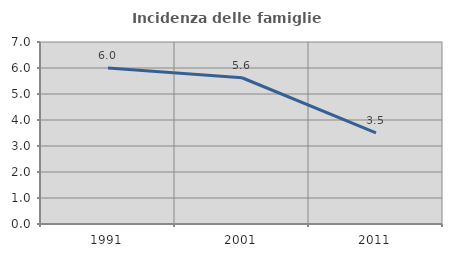
| Category | Incidenza delle famiglie numerose |
|---|---|
| 1991.0 | 6 |
| 2001.0 | 5.625 |
| 2011.0 | 3.509 |